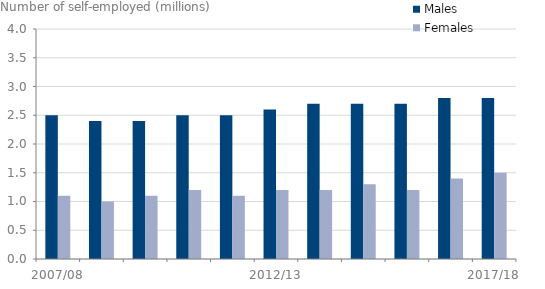
| Category | Males | Females |
|---|---|---|
| 2007/08 | 2.5 | 1.1 |
| 2008/09 | 2.4 | 1 |
| 2009/10 | 2.4 | 1.1 |
| 2010/11 | 2.5 | 1.2 |
| 2011/12 | 2.5 | 1.1 |
| 2012/13 | 2.6 | 1.2 |
| 2013/14 | 2.7 | 1.2 |
| 2014/15 | 2.7 | 1.3 |
| 2015/16 | 2.7 | 1.2 |
| 2016/17 | 2.8 | 1.4 |
| 2017/18 | 2.8 | 1.5 |